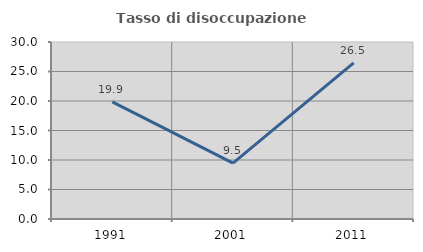
| Category | Tasso di disoccupazione giovanile  |
|---|---|
| 1991.0 | 19.858 |
| 2001.0 | 9.474 |
| 2011.0 | 26.471 |